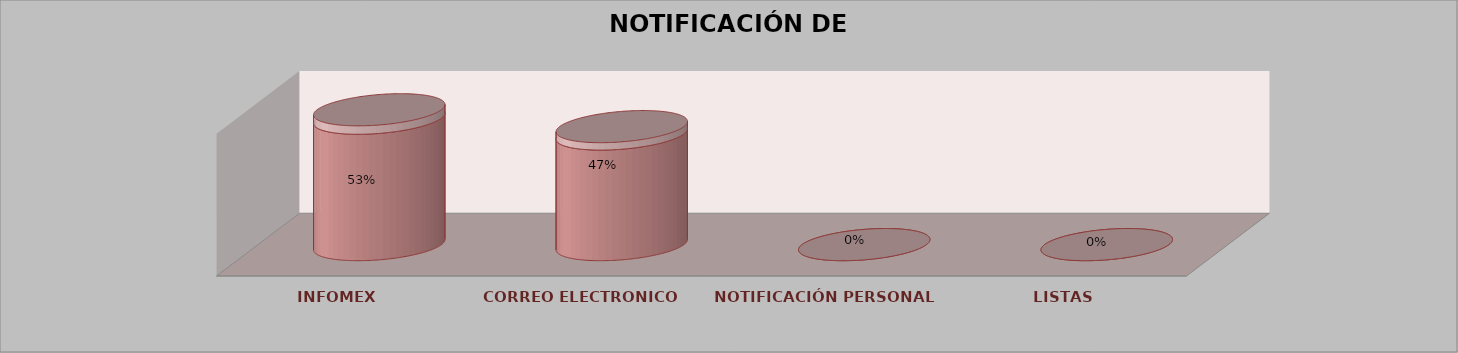
| Category | Series 0 | Series 1 | Series 2 | Series 3 | Series 4 |
|---|---|---|---|---|---|
| INFOMEX |  |  |  | 8 | 0.533 |
| CORREO ELECTRONICO |  |  |  | 7 | 0.467 |
| NOTIFICACIÓN PERSONAL |  |  |  | 0 | 0 |
| LISTAS |  |  |  | 0 | 0 |